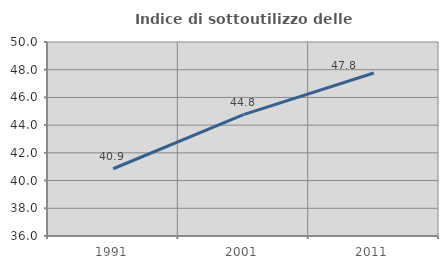
| Category | Indice di sottoutilizzo delle abitazioni  |
|---|---|
| 1991.0 | 40.853 |
| 2001.0 | 44.761 |
| 2011.0 | 47.764 |